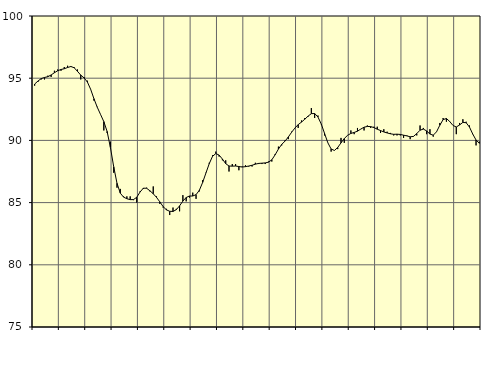
| Category | Piggar | Series 1 |
|---|---|---|
| nan | 94.4 | 94.53 |
| 87.0 | 94.7 | 94.77 |
| 87.0 | 94.9 | 94.97 |
| 87.0 | 94.9 | 95.06 |
| nan | 95.2 | 95.12 |
| 88.0 | 95.1 | 95.26 |
| 88.0 | 95.6 | 95.44 |
| 88.0 | 95.7 | 95.6 |
| nan | 95.6 | 95.7 |
| 89.0 | 95.9 | 95.76 |
| 89.0 | 96 | 95.86 |
| 89.0 | 95.9 | 95.94 |
| nan | 95.9 | 95.84 |
| 90.0 | 95.7 | 95.55 |
| 90.0 | 94.9 | 95.25 |
| 90.0 | 95.1 | 95.02 |
| nan | 94.8 | 94.7 |
| 91.0 | 94.1 | 94.11 |
| 91.0 | 93.2 | 93.35 |
| 91.0 | 92.7 | 92.67 |
| nan | 92.1 | 92.09 |
| 92.0 | 90.8 | 91.51 |
| 92.0 | 90.6 | 90.72 |
| 92.0 | 89.9 | 89.43 |
| nan | 87.4 | 87.88 |
| 93.0 | 86.2 | 86.55 |
| 93.0 | 86.1 | 85.76 |
| 93.0 | 85.5 | 85.44 |
| nan | 85.5 | 85.31 |
| 94.0 | 85.5 | 85.24 |
| 94.0 | 85.2 | 85.24 |
| 94.0 | 85 | 85.43 |
| nan | 85.9 | 85.85 |
| 95.0 | 86.1 | 86.16 |
| 95.0 | 86.2 | 86.15 |
| 95.0 | 85.9 | 85.95 |
| nan | 86.3 | 85.71 |
| 96.0 | 85.5 | 85.42 |
| 96.0 | 84.9 | 85.06 |
| 96.0 | 84.6 | 84.68 |
| nan | 84.5 | 84.42 |
| 97.0 | 84 | 84.3 |
| 97.0 | 84.6 | 84.29 |
| 97.0 | 84.5 | 84.43 |
| nan | 84.3 | 84.74 |
| 98.0 | 85.6 | 85.12 |
| 98.0 | 85.1 | 85.41 |
| 98.0 | 85.4 | 85.53 |
| nan | 85.8 | 85.53 |
| 99.0 | 85.3 | 85.64 |
| 99.0 | 85.9 | 85.99 |
| 99.0 | 86.8 | 86.62 |
| nan | 87.4 | 87.38 |
| 0.0 | 88.2 | 88.13 |
| 0.0 | 88.8 | 88.72 |
| 0.0 | 89.1 | 88.94 |
| nan | 88.7 | 88.82 |
| 1.0 | 88.4 | 88.5 |
| 1.0 | 88.4 | 88.13 |
| 1.0 | 87.5 | 87.94 |
| nan | 88.1 | 87.93 |
| 2.0 | 88.1 | 87.94 |
| 2.0 | 87.6 | 87.9 |
| 2.0 | 87.9 | 87.86 |
| nan | 88 | 87.89 |
| 3.0 | 87.9 | 87.94 |
| 3.0 | 87.9 | 88 |
| 3.0 | 88.2 | 88.09 |
| nan | 88.1 | 88.15 |
| 4.0 | 88.1 | 88.17 |
| 4.0 | 88.1 | 88.19 |
| 4.0 | 88.3 | 88.25 |
| nan | 88.3 | 88.44 |
| 5.0 | 88.9 | 88.84 |
| 5.0 | 89.5 | 89.3 |
| 5.0 | 89.6 | 89.68 |
| nan | 90 | 89.94 |
| 6.0 | 90.1 | 90.27 |
| 6.0 | 90.7 | 90.65 |
| 6.0 | 91 | 90.99 |
| nan | 91 | 91.27 |
| 7.0 | 91.6 | 91.47 |
| 7.0 | 91.8 | 91.7 |
| 7.0 | 91.9 | 91.95 |
| nan | 92.6 | 92.15 |
| 8.0 | 91.8 | 92.16 |
| 8.0 | 92 | 91.88 |
| 8.0 | 91.3 | 91.32 |
| nan | 90.4 | 90.57 |
| 9.0 | 89.8 | 89.81 |
| 9.0 | 89.1 | 89.31 |
| 9.0 | 89.2 | 89.19 |
| nan | 89.3 | 89.43 |
| 10.0 | 90.2 | 89.8 |
| 10.0 | 89.8 | 90.15 |
| 10.0 | 90.4 | 90.41 |
| nan | 90.8 | 90.56 |
| 11.0 | 90.5 | 90.64 |
| 11.0 | 91 | 90.74 |
| 11.0 | 90.9 | 90.91 |
| nan | 90.8 | 91.06 |
| 12.0 | 91.2 | 91.12 |
| 12.0 | 91 | 91.11 |
| 12.0 | 91.1 | 91.03 |
| nan | 91.1 | 90.9 |
| 13.0 | 90.6 | 90.79 |
| 13.0 | 90.9 | 90.68 |
| 13.0 | 90.7 | 90.6 |
| nan | 90.6 | 90.53 |
| 14.0 | 90.4 | 90.49 |
| 14.0 | 90.4 | 90.5 |
| 14.0 | 90.4 | 90.48 |
| nan | 90.2 | 90.42 |
| 15.0 | 90.4 | 90.36 |
| 15.0 | 90.1 | 90.29 |
| 15.0 | 90.3 | 90.32 |
| nan | 90.4 | 90.55 |
| 16.0 | 91.2 | 90.82 |
| 16.0 | 91 | 90.91 |
| 16.0 | 90.5 | 90.76 |
| nan | 90.9 | 90.51 |
| 17.0 | 90.3 | 90.42 |
| 17.0 | 90.7 | 90.69 |
| 17.0 | 91.4 | 91.22 |
| nan | 91.8 | 91.67 |
| 18.0 | 91.5 | 91.76 |
| 18.0 | 91.5 | 91.52 |
| 18.0 | 91.2 | 91.2 |
| nan | 90.5 | 91.08 |
| 19.0 | 91.4 | 91.24 |
| 19.0 | 91.7 | 91.45 |
| 19.0 | 91.5 | 91.42 |
| nan | 91.2 | 91.07 |
| 20.0 | 90.5 | 90.51 |
| 20.0 | 89.6 | 90.03 |
| 20.0 | 89.9 | 89.77 |